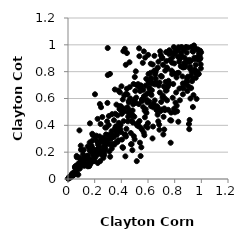
| Category | Series 0 |
|---|---|
| 0.8048160379679911 | 0.784 |
| 0.6412530690746505 | 0.561 |
| 0.036848699491668656 | 0.043 |
| 0.8508803725687043 | 0.92 |
| 0.6913978955041147 | 0.952 |
| 0.3902861109157759 | 0.521 |
| 0.5729293044220957 | 0.326 |
| 0.8110375856228726 | 0.645 |
| 0.24806886873163023 | 0.535 |
| 0.5027506385205199 | 0.594 |
| 0.44573678088368307 | 0.535 |
| 0.3434325248215889 | 0.26 |
| 0.561053336274124 | 0.866 |
| 0.24146370101987005 | 0.134 |
| 0.7851093031259042 | 0.606 |
| 0.20997103220456537 | 0.205 |
| 0.4303696479341876 | 0.169 |
| 0.10259249432398762 | 0.108 |
| 0.7798508613737885 | 0.867 |
| 0.24624403608130385 | 0.276 |
| 0.1730998822928173 | 0.133 |
| 0.8730987772841702 | 0.905 |
| 0.4771677226068377 | 0.259 |
| 0.19122029559249532 | 0.135 |
| 0.6785153978333146 | 0.874 |
| 0.03936746894879441 | 0.033 |
| 0.3206762801182168 | 0.303 |
| 0.38258311964538483 | 0.358 |
| 0.3844784113742594 | 0.542 |
| 0.3681660735472492 | 0.37 |
| 0.9689709140385898 | 0.784 |
| 0.6462743098852863 | 0.546 |
| 0.3099631757098164 | 0.259 |
| 0.8287489505397968 | 0.982 |
| 0.6857148374560557 | 0.367 |
| 0.4087598701721895 | 0.237 |
| 0.8693786946081973 | 0.959 |
| 0.8402111569531753 | 0.911 |
| 0.19983808856500268 | 0.188 |
| 0.806252504612378 | 0.57 |
| 0.29783745806520745 | 0.976 |
| 0.5157899796305667 | 0.133 |
| 0.8810528820988379 | 0.844 |
| 0.1490733598868999 | 0.094 |
| 0.4493409079521291 | 0.43 |
| 0.3490803277755809 | 0.257 |
| 0.8484357229467564 | 0.941 |
| 0.5293458375933919 | 0.687 |
| 0.4749559854918523 | 0.472 |
| 0.9367280181722548 | 0.537 |
| 0.6038354053874117 | 0.783 |
| 0.21098582234768798 | 0.215 |
| 0.12069687325942724 | 0.123 |
| 0.23005677510613035 | 0.192 |
| 0.020099144285102177 | 0.012 |
| 0.053496653326204194 | 0.085 |
| 0.14721049749832843 | 0.242 |
| 0.6044248210849298 | 0.728 |
| 0.9335570871204969 | 0.953 |
| 0.3604468680700396 | 0.357 |
| 0.643231094605576 | 0.716 |
| 0.9166533555953422 | 0.836 |
| 0.18891535484765548 | 0.181 |
| 0.37750553958991206 | 0.659 |
| 0.06481725295512407 | 0.172 |
| 0.49156706209330986 | 0.708 |
| 0.7650278276645177 | 0.888 |
| 0.7452519194500642 | 0.823 |
| 0.7916464292578508 | 0.94 |
| 0.4068009759231473 | 0.501 |
| 0.710834982930877 | 0.622 |
| 0.3133821718840352 | 0.324 |
| 0.7490497289972962 | 0.688 |
| 0.7035959168923077 | 0.763 |
| 0.3720860219728402 | 0.475 |
| 0.32833079129278914 | 0.227 |
| 0.6681677695936914 | 0.542 |
| 0.8272894318442069 | 0.427 |
| 0.04891064579619808 | 0.036 |
| 0.16629359704728555 | 0.11 |
| 0.023419354639812224 | 0.025 |
| 0.7985722187898523 | 0.933 |
| 0.16991982198271896 | 0.143 |
| 0.15444429967702467 | 0.153 |
| 0.18132061599412014 | 0.284 |
| 0.1702111666286856 | 0.204 |
| 0.9632057759010246 | 0.792 |
| 0.19315112764321993 | 0.167 |
| 0.31952743968310005 | 0.261 |
| 0.5693081703095949 | 0.951 |
| 0.004251761930587647 | 0.007 |
| 0.7430421501633343 | 0.586 |
| 0.697427239802067 | 0.768 |
| 0.9724679511926295 | 0.967 |
| 0.2173645918353844 | 0.281 |
| 0.9247368946319299 | 0.772 |
| 0.3632946576171775 | 0.554 |
| 0.5954264067940941 | 0.57 |
| 0.46419356395634676 | 0.48 |
| 0.6228622303132113 | 0.542 |
| 0.057300796040171006 | 0.097 |
| 0.4566102081277897 | 0.572 |
| 0.10893398358415206 | 0.134 |
| 0.6988001847450622 | 0.574 |
| 0.5646004305925687 | 0.664 |
| 0.33209803322518666 | 0.326 |
| 0.8081089625540443 | 0.964 |
| 0.596931256951981 | 0.383 |
| 0.3476574740772269 | 0.322 |
| 0.1397871017129596 | 0.111 |
| 0.45891351403084435 | 0.515 |
| 0.7169305897725119 | 0.463 |
| 0.9788435390067388 | 0.886 |
| 0.5787156323363809 | 0.904 |
| 0.7810713402161075 | 0.781 |
| 0.18611837737125309 | 0.327 |
| 0.05574871979741117 | 0.079 |
| 0.6547178969240556 | 0.778 |
| 0.17496583944255623 | 0.123 |
| 0.058492048325131656 | 0.053 |
| 0.2678159602451641 | 0.243 |
| 0.9384272792149398 | 0.949 |
| 0.1375155422211428 | 0.15 |
| 0.5160043820291768 | 0.403 |
| 0.695459926332687 | 0.924 |
| 0.8390021300136582 | 0.587 |
| 0.5818468911274911 | 0.696 |
| 0.9431416118818199 | 0.967 |
| 0.3654362141563176 | 0.277 |
| 0.35707544375562 | 0.36 |
| 0.7148270507419545 | 0.332 |
| 0.626209773768254 | 0.626 |
| 0.13431791821315836 | 0.152 |
| 0.9470443444692167 | 0.904 |
| 0.5500117425196831 | 0.236 |
| 0.9153122706672439 | 0.822 |
| 0.3588409693787901 | 0.392 |
| 0.5316174513720017 | 0.558 |
| 0.6642284447830702 | 0.515 |
| 0.7004161813679188 | 0.518 |
| 0.6769812162106348 | 0.43 |
| 0.3511859927170877 | 0.667 |
| 0.5750788586440214 | 0.509 |
| 0.8186558311569169 | 0.505 |
| 0.5678505033831696 | 0.347 |
| 0.2934922295686538 | 0.43 |
| 0.6314525070198469 | 0.711 |
| 0.28744572002241525 | 0.273 |
| 0.07585643305672715 | 0.086 |
| 0.32721904516621003 | 0.356 |
| 0.2792917243822691 | 0.383 |
| 0.1784138644780996 | 0.225 |
| 0.03143687584005224 | 0.04 |
| 0.576562385706362 | 0.46 |
| 0.37175541279924923 | 0.277 |
| 0.46128121574113173 | 0.87 |
| 0.8016925349532842 | 0.497 |
| 0.0025459312360142203 | 0.004 |
| 0.7255467778042767 | 0.601 |
| 0.8432535680032459 | 0.904 |
| 0.011003315112321476 | 0.011 |
| 0.7592884501775933 | 0.959 |
| 0.5193021105814963 | 0.405 |
| 0.7622489972222245 | 0.711 |
| 0.20782627532021755 | 0.193 |
| 0.07356854222332326 | 0.111 |
| 0.4187776700320601 | 0.525 |
| 0.9803273252812976 | 0.783 |
| 0.12572369945368816 | 0.106 |
| 0.9962262809924376 | 0.824 |
| 0.955091528708835 | 0.807 |
| 0.6069447748188267 | 0.716 |
| 0.5394631853148955 | 0.271 |
| 0.22332432873438213 | 0.119 |
| 0.8957698591122799 | 0.656 |
| 0.7891461199333766 | 0.708 |
| 0.0996434141433899 | 0.14 |
| 0.41515034023000635 | 0.953 |
| 0.5905139478385715 | 0.591 |
| 0.41675038389553093 | 0.431 |
| 0.773657236450272 | 0.495 |
| 0.44212130910114417 | 0.939 |
| 0.02567283399442044 | 0.03 |
| 0.7357055891118258 | 0.946 |
| 0.712584043953238 | 0.851 |
| 0.3528253194551974 | 0.379 |
| 0.12858840296570873 | 0.161 |
| 0.3243486007848635 | 0.302 |
| 0.7292748688178311 | 0.808 |
| 0.6128191903510176 | 0.665 |
| 0.2652916094593917 | 0.157 |
| 0.17699813911388584 | 0.248 |
| 0.18206875130349506 | 0.337 |
| 0.03367878854220705 | 0.021 |
| 0.20457784158936188 | 0.308 |
| 0.35437475748089486 | 0.486 |
| 0.30188381878609855 | 0.294 |
| 0.7832535737038714 | 0.906 |
| 0.8378237581727616 | 0.894 |
| 0.8878453451417957 | 0.981 |
| 0.7227709617211416 | 0.526 |
| 0.27119482135427997 | 0.178 |
| 0.6741525502740761 | 0.83 |
| 0.2846269977825291 | 0.332 |
| 0.04248283480025894 | 0.029 |
| 0.10569333759641586 | 0.104 |
| 0.3149154482639664 | 0.783 |
| 0.10613027869866468 | 0.137 |
| 0.6008738392626107 | 0.925 |
| 0.5583455519500062 | 0.595 |
| 0.019526181794592687 | 0.021 |
| 0.7319281915286389 | 0.724 |
| 0.3863287146455442 | 0.521 |
| 0.2502086209785679 | 0.296 |
| 0.5118125078379672 | 0.607 |
| 0.9359485178314961 | 0.748 |
| 0.02626952171052562 | 0.031 |
| 0.6189620236211834 | 0.791 |
| 0.32380969739468063 | 0.311 |
| 0.23548311139305195 | 0.19 |
| 0.08802271889430067 | 0.078 |
| 0.3303849235876428 | 0.483 |
| 0.5362201288249856 | 0.432 |
| 0.39445658199639444 | 0.403 |
| 0.8211185322290097 | 0.79 |
| 0.884926725820854 | 0.983 |
| 0.554770012315542 | 0.368 |
| 0.5047507612138872 | 0.656 |
| 0.8138530986290082 | 0.757 |
| 0.4936511180437289 | 0.32 |
| 0.5257141636804944 | 0.707 |
| 0.07729899798224192 | 0.032 |
| 0.22195285289826638 | 0.448 |
| 0.6611505145517063 | 0.814 |
| 0.48879040461983303 | 0.557 |
| 0.2574499699053005 | 0.462 |
| 0.15372361772268164 | 0.137 |
| 0.12216927066635556 | 0.098 |
| 0.9569947193062386 | 0.851 |
| 0.80283383021104 | 0.946 |
| 0.2272596090131578 | 0.23 |
| 0.7329941121807774 | 0.659 |
| 0.05169937658675466 | 0.091 |
| 0.2389293736291419 | 0.559 |
| 0.19409776975635853 | 0.194 |
| 0.1114741315942896 | 0.11 |
| 0.09720404005544354 | 0.218 |
| 0.40507617500263177 | 0.294 |
| 0.012877030387724989 | 0.011 |
| 0.006186548690355044 | 0.01 |
| 0.6480284451013497 | 0.918 |
| 0.49990928045378746 | 0.295 |
| 0.08582776277927397 | 0.362 |
| 0.3066266022679924 | 0.469 |
| 0.9495267015247435 | 0.816 |
| 0.6338795058866682 | 0.303 |
| 0.09564642717308515 | 0.249 |
| 0.845718230965016 | 0.841 |
| 0.8798297608187026 | 0.708 |
| 0.6104640549995154 | 0.575 |
| 0.9773982121956997 | 0.783 |
| 0.9023455612930342 | 0.98 |
| 0.2024244632717279 | 0.631 |
| 0.33630020221003804 | 0.324 |
| 0.09334830717075344 | 0.147 |
| 0.436367324262943 | 0.636 |
| 0.4037290532755966 | 0.486 |
| 0.5858075881716347 | 0.393 |
| 0.5639277297016065 | 0.536 |
| 0.7377081769587723 | 0.879 |
| 0.5701948762098781 | 0.618 |
| 0.2982828558493133 | 0.774 |
| 0.06602702955017496 | 0.162 |
| 0.7767001165413997 | 0.808 |
| 0.8540516027454408 | 0.983 |
| 0.2885757618384845 | 0.385 |
| 0.5536851859976736 | 0.589 |
| 0.8714939164513476 | 0.864 |
| 0.8169132408031525 | 0.954 |
| 0.9604627735899908 | 0.786 |
| 0.13353072803829116 | 0.11 |
| 0.16116040444494234 | 0.215 |
| 0.645677240170929 | 0.806 |
| 0.8923328184327886 | 0.749 |
| 0.2445044592955393 | 0.41 |
| 0.49742016741247386 | 0.465 |
| 0.5212950531172788 | 0.415 |
| 0.46291493973622916 | 0.685 |
| 0.22435324083276867 | 0.257 |
| 0.11328195037163839 | 0.183 |
| 0.04542772198222292 | 0.045 |
| 0.14172102281630997 | 0.106 |
| 0.8233251014317677 | 0.913 |
| 0.38136331223588515 | 0.418 |
| 0.5447603854827491 | 0.171 |
| 0.44630200163421735 | 0.629 |
| 0.6152622673486504 | 0.64 |
| 0.06954432759656205 | 0.034 |
| 0.9538337138075925 | 0.973 |
| 0.07823886163864259 | 0.096 |
| 0.29567267988940527 | 0.567 |
| 0.6209758316676542 | 0.859 |
| 0.4711321878775796 | 0.343 |
| 0.46733872729850434 | 0.6 |
| 0.04623738387279152 | 0.035 |
| 0.9185754063880479 | 0.6 |
| 0.9111752724431398 | 0.888 |
| 0.9930836196339418 | 0.9 |
| 0.90451054648089 | 0.871 |
| 0.8899003543592757 | 0.886 |
| 0.693345514646579 | 0.505 |
| 0.5431662295309747 | 0.384 |
| 0.3896380970998756 | 0.646 |
| 0.30515867955544 | 0.403 |
| 0.029177174765890736 | 0.02 |
| 0.03473832320113161 | 0.028 |
| 0.5886629924351962 | 0.493 |
| 0.835591764989214 | 0.674 |
| 0.9950032082174447 | 0.854 |
| 0.2588373860797932 | 0.307 |
| 0.060135003793550426 | 0.056 |
| 0.7463788877903434 | 0.721 |
| 0.592633580028227 | 0.635 |
| 0.3162496985230245 | 0.166 |
| 0.20126166044251567 | 0.156 |
| 0.6241956494478965 | 0.752 |
| 0.08679455388774969 | 0.08 |
| 0.9274336521782525 | 0.799 |
| 0.7091191694231516 | 0.608 |
| 0.6804002939747648 | 0.696 |
| 0.5352446029543049 | 0.915 |
| 0.982633620595707 | 0.935 |
| 0.0014173401793039727 | 0.002 |
| 0.41253459651920354 | 0.232 |
| 0.42771417932345396 | 0.328 |
| 0.3024526287686202 | 0.329 |
| 0.5869260479446795 | 0.747 |
| 0.9847453372522129 | 0.918 |
| 0.9502558711059987 | 0.892 |
| 0.48625964030769175 | 0.421 |
| 0.40118843626863987 | 0.691 |
| 0.26075685522955766 | 0.278 |
| 0.19626981598331356 | 0.133 |
| 0.8961353264265077 | 0.729 |
| 0.008951014118490511 | 0.016 |
| 0.8670603424126889 | 0.676 |
| 0.9716295100431026 | 0.797 |
| 0.4686047192664362 | 0.488 |
| 0.7047381538014715 | 0.9 |
| 0.12635470994151074 | 0.152 |
| 0.31008074148234 | 0.205 |
| 0.374935448754331 | 0.384 |
| 0.3447304075864913 | 0.438 |
| 0.27539367529782316 | 0.291 |
| 0.9126504838109599 | 0.44 |
| 0.7666258164017056 | 0.438 |
| 0.28295579248363056 | 0.253 |
| 0.508342251192858 | 0.802 |
| 0.39321054214407003 | 0.371 |
| 0.26812384855005045 | 0.234 |
| 0.48136507836854203 | 0.479 |
| 0.8472000293063932 | 0.981 |
| 0.6095097475139214 | 0.68 |
| 0.1566214265517475 | 0.097 |
| 0.7397729982779764 | 0.661 |
| 0.8538222985448833 | 0.837 |
| 0.28131536653435685 | 0.224 |
| 0.5410113143359803 | 0.656 |
| 0.16263601469403038 | 0.272 |
| 0.6719616360124111 | 0.479 |
| 0.5008025319284766 | 0.76 |
| 0.9450038752325354 | 0.996 |
| 0.7218275351179362 | 0.369 |
| 0.36753989602754356 | 0.331 |
| 0.9644264661205062 | 0.597 |
| 0.24244693615111684 | 0.2 |
| 0.4552812150957252 | 0.58 |
| 0.7934859104057508 | 0.983 |
| 0.861456895910077 | 0.713 |
| 0.23647019126137492 | 0.317 |
| 0.7708872536418231 | 0.939 |
| 0.4523679563511088 | 0.496 |
| 0.435180899166777 | 0.316 |
| 0.8562217136463667 | 0.681 |
| 0.1841013702159052 | 0.23 |
| 0.4219888138147045 | 0.623 |
| 0.9236828227154171 | 0.678 |
| 0.11961414322667153 | 0.158 |
| 0.7569432886640876 | 0.932 |
| 0.9912602430137946 | 0.956 |
| 0.8759689700202944 | 0.711 |
| 0.23329685106903708 | 0.239 |
| 0.3784666447933918 | 0.289 |
| 0.76153144905519 | 0.957 |
| 0.6887186105020155 | 0.645 |
| 0.7956687180878755 | 0.523 |
| 0.719378736267653 | 0.689 |
| 0.041499562839395265 | 0.046 |
| 0.09057465893928303 | 0.127 |
| 0.7746516469322732 | 0.436 |
| 0.7553424669311714 | 0.706 |
| 0.9665617627023164 | 0.905 |
| 0.3987209460061791 | 0.349 |
| 0.9742837852943418 | 0.962 |
| 0.4844253448565549 | 0.511 |
| 0.7269521220533531 | 0.513 |
| 0.9069609003898131 | 0.41 |
| 0.6872224141608977 | 0.719 |
| 0.5829618563947645 | 0.519 |
| 0.4335052004827897 | 0.851 |
| 0.13169487578507857 | 0.145 |
| 0.6566089395323323 | 0.797 |
| 0.2639255128353661 | 0.292 |
| 0.2765287404126788 | 0.298 |
| 0.6390117044772514 | 0.534 |
| 0.9301674912684056 | 0.729 |
| 0.5992929948883348 | 0.416 |
| 0.8153905685128157 | 0.547 |
| 0.9205150469132967 | 0.879 |
| 0.4259065800518511 | 0.97 |
| 0.8583198121879995 | 0.764 |
| 0.016319693774990665 | 0.012 |
| 0.513187397122194 | 0.702 |
| 0.6663663677588026 | 0.513 |
| 0.11756236196857932 | 0.217 |
| 0.4729816625497727 | 0.259 |
| 0.06354872401932923 | 0.08 |
| 0.7516971592958311 | 0.516 |
| 0.7074827867167729 | 0.904 |
| 0.8300571113545581 | 0.792 |
| 0.4414608648082849 | 0.672 |
| 0.3342864665711034 | 0.26 |
| 0.9583146697958732 | 0.754 |
| 0.3386570557855668 | 0.32 |
| 0.9411610354700035 | 0.625 |
| 0.5262022897289605 | 0.393 |
| 0.7867224411858997 | 0.794 |
| 0.4288211925171365 | 0.333 |
| 0.4382168163578531 | 0.373 |
| 0.5229539007081078 | 0.41 |
| 0.833956175453485 | 0.874 |
| 0.6356167118776629 | 0.853 |
| 0.9019803704293399 | 0.693 |
| 0.49475358526100255 | 0.579 |
| 0.14583691243497582 | 0.101 |
| 0.8620066643203624 | 0.631 |
| 0.7974026840709623 | 0.861 |
| 0.7699843633873352 | 0.27 |
| 0.3411244877127755 | 0.313 |
| 0.08046556629204787 | 0.077 |
| 0.15036181048545097 | 0.174 |
| 0.5062537922012279 | 0.567 |
| 0.014703220502637145 | 0.016 |
| 0.6725819227668881 | 0.532 |
| 0.989411404189051 | 0.893 |
| 0.21224475868005416 | 0.323 |
| 0.8993334392982846 | 0.763 |
| 0.39648743595194247 | 0.542 |
| 0.4236894743046 | 0.504 |
| 0.7534884722674006 | 0.732 |
| 0.533160720813824 | 0.974 |
| 0.1011751668344194 | 0.106 |
| 0.27282527164016507 | 0.2 |
| 0.2900080108782295 | 0.29 |
| 0.48282163197100664 | 0.215 |
| 0.08239851724877918 | 0.16 |
| 0.9985994271823669 | 0.944 |
| 0.629030960506534 | 0.661 |
| 0.6521424917634908 | 0.705 |
| 0.2543821224929723 | 0.211 |
| 0.2184824302737793 | 0.192 |
| 0.9094795172371621 | 0.371 |
| 0.41083057306726245 | 0.593 |
| 0.9284357248829761 | 0.985 |
| 0.6626427791664942 | 0.717 |
| 0.6581896940297888 | 0.748 |
| 0.25399014575965473 | 0.181 |
| 0.5490534452314146 | 0.682 |
| 0.47865498994771744 | 0.433 |
| 0.7411382445262601 | 0.831 |
| 0.0705422653985541 | 0.093 |
| 0.14342377212769908 | 0.172 |
| 0.1644417291298606 | 0.415 |
| 0.11558285317234294 | 0.115 |
| 0.6179660438168715 | 0.743 |
| 0.5466750071893155 | 0.698 |
| 0.8832712474533523 | 0.719 |
| 0.6503352628211341 | 0.586 |
| 0.6378421120396448 | 0.391 |
| 0.556653714259773 | 0.581 |
| 0.864092065002325 | 0.831 |
| 0.4513612883704159 | 0.465 |
| 0.8765018873034283 | 0.834 |
| 0.21545099588051694 | 0.176 |
| 0.22934550306465137 | 0.267 |
| 0.9868953963175638 | 0.919 |
| 0.6834623554245248 | 0.406 |
| 0.8904267720241162 | 0.942 |
| 0.8255797019972418 | 0.968 |
| 0.1595955461793569 | 0.096 |